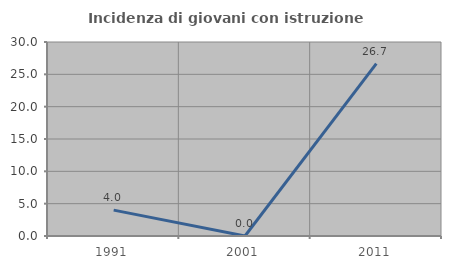
| Category | Incidenza di giovani con istruzione universitaria |
|---|---|
| 1991.0 | 4 |
| 2001.0 | 0 |
| 2011.0 | 26.667 |